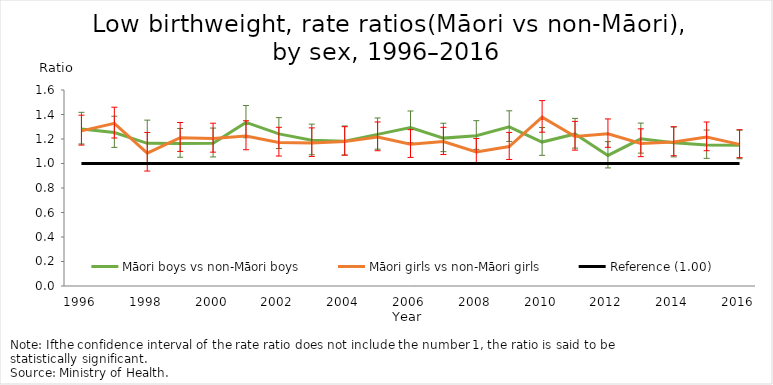
| Category | Māori boys vs non-Māori boys | Māori girls vs non-Māori girls | Reference (1.00) |
|---|---|---|---|
| 1996.0 | 1.282 | 1.266 | 1 |
| 1997.0 | 1.252 | 1.328 | 1 |
| 1998.0 | 1.165 | 1.084 | 1 |
| 1999.0 | 1.163 | 1.211 | 1 |
| 2000.0 | 1.165 | 1.205 | 1 |
| 2001.0 | 1.335 | 1.225 | 1 |
| 2002.0 | 1.242 | 1.172 | 1 |
| 2003.0 | 1.19 | 1.168 | 1 |
| 2004.0 | 1.182 | 1.179 | 1 |
| 2005.0 | 1.238 | 1.216 | 1 |
| 2006.0 | 1.293 | 1.158 | 1 |
| 2007.0 | 1.207 | 1.179 | 1 |
| 2008.0 | 1.227 | 1.095 | 1 |
| 2009.0 | 1.299 | 1.138 | 1 |
| 2010.0 | 1.175 | 1.378 | 1 |
| 2011.0 | 1.241 | 1.221 | 1 |
| 2012.0 | 1.066 | 1.243 | 1 |
| 2013.0 | 1.201 | 1.164 | 1 |
| 2014.0 | 1.17 | 1.176 | 1 |
| 2015.0 | 1.152 | 1.216 | 1 |
| 2016.0 | 1.15 | 1.156 | 1 |